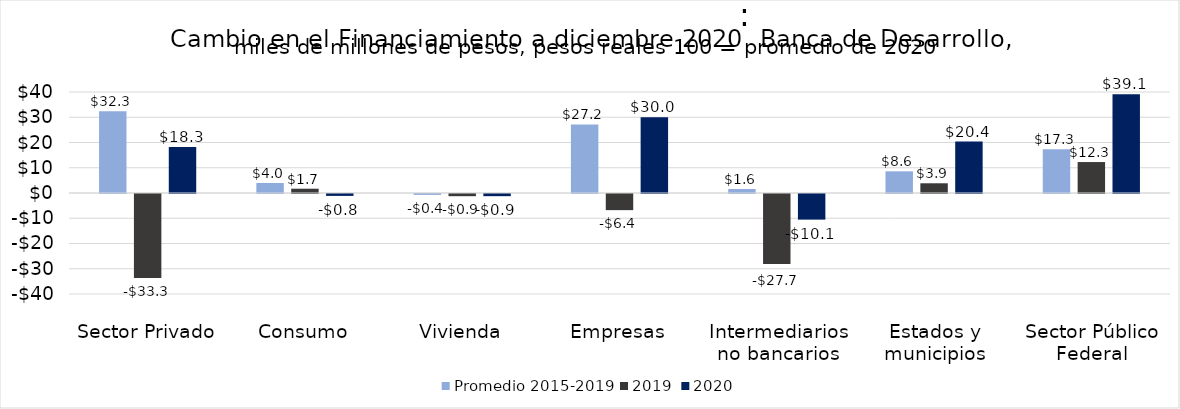
| Category | Promedio 2015-2019 | 2019 | 2020 |
|---|---|---|---|
| Sector Privado | 32.331 | -33.297 | 18.253 |
| Consumo | 3.955 | 1.7 | -0.752 |
| Vivienda | -0.361 | -0.869 | -0.859 |
| Empresas | 27.158 | -6.391 | 30.013 |
| Intermediarios no bancarios | 1.58 | -27.737 | -10.149 |
| Estados y municipios | 8.577 | 3.853 | 20.368 |
| Sector Público Federal | 17.283 | 12.259 | 39.133 |